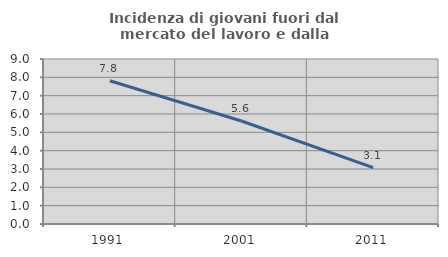
| Category | Incidenza di giovani fuori dal mercato del lavoro e dalla formazione  |
|---|---|
| 1991.0 | 7.812 |
| 2001.0 | 5.618 |
| 2011.0 | 3.077 |